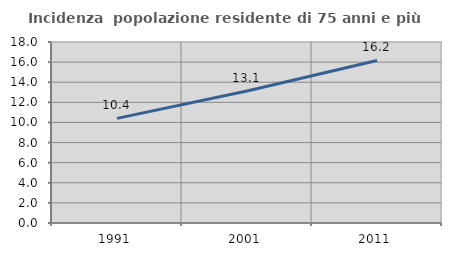
| Category | Incidenza  popolazione residente di 75 anni e più |
|---|---|
| 1991.0 | 10.404 |
| 2001.0 | 13.121 |
| 2011.0 | 16.163 |